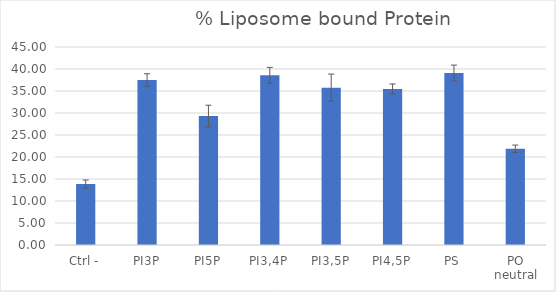
| Category | Series 0 |
|---|---|
| Ctrl - | 13.836 |
| PI3P | 37.513 |
| PI5P | 29.311 |
| PI3,4P | 38.568 |
| PI3,5P | 35.756 |
| PI4,5P | 35.464 |
| PS | 39.1 |
| PO neutral | 21.877 |